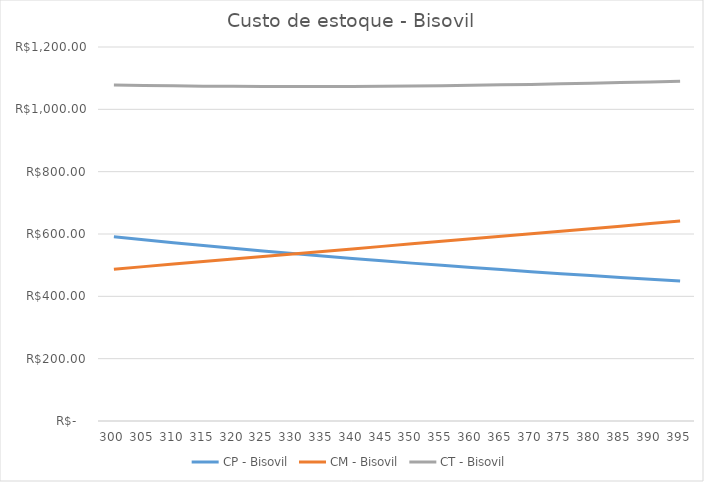
| Category | CP - Bisovil | CM - Bisovil | CT - Bisovil |
|---|---|---|---|
| 300.0 | 590.961 | 487.2 | 1078.161 |
| 305.0 | 581.273 | 495.32 | 1076.593 |
| 310.0 | 571.898 | 503.44 | 1075.338 |
| 315.0 | 562.82 | 511.56 | 1074.38 |
| 320.0 | 554.026 | 519.68 | 1073.706 |
| 325.0 | 545.503 | 527.8 | 1073.303 |
| 330.0 | 537.237 | 535.92 | 1073.157 |
| 335.0 | 529.219 | 544.04 | 1073.259 |
| 340.0 | 521.436 | 552.16 | 1073.596 |
| 345.0 | 513.879 | 560.28 | 1074.159 |
| 350.0 | 506.538 | 568.4 | 1074.938 |
| 355.0 | 499.404 | 576.52 | 1075.924 |
| 360.0 | 492.468 | 584.64 | 1077.108 |
| 365.0 | 485.722 | 592.76 | 1078.482 |
| 370.0 | 479.158 | 600.88 | 1080.038 |
| 375.0 | 472.769 | 609 | 1081.769 |
| 380.0 | 466.548 | 617.12 | 1083.668 |
| 385.0 | 460.489 | 625.24 | 1085.729 |
| 390.0 | 454.586 | 633.36 | 1087.946 |
| 395.0 | 448.831 | 641.48 | 1090.311 |